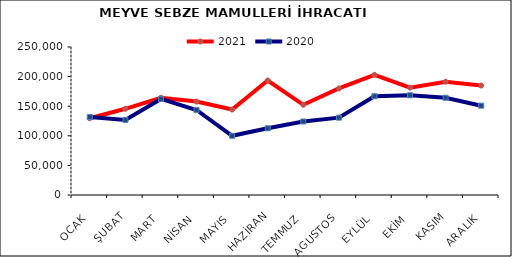
| Category | 2021 | 2020 |
|---|---|---|
| OCAK | 129703.741 | 131869.984 |
| ŞUBAT | 145631.383 | 126847.161 |
| MART | 164304.422 | 162232.91 |
| NİSAN | 157785.559 | 143635.709 |
| MAYIS | 144432.522 | 99998.845 |
| HAZİRAN | 193443.597 | 112658.944 |
| TEMMUZ | 152389.32 | 124157.464 |
| AGUSTOS | 180052.231 | 130627.092 |
| EYLÜL | 203018.999 | 166814.961 |
| EKİM | 181415.952 | 168475.022 |
| KASIM | 191301.301 | 164270.137 |
| ARALIK | 184882.218 | 150888.818 |